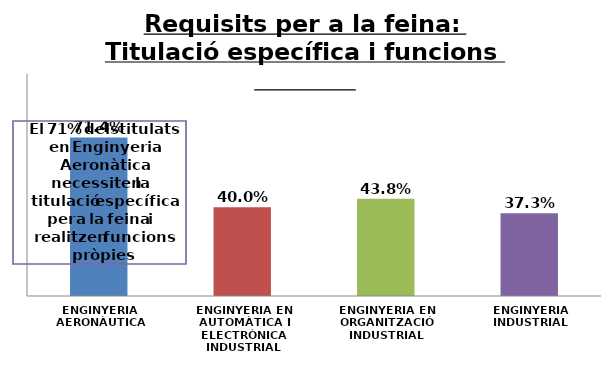
| Category | Series 2 |
|---|---|
| ENGINYERIA AERONÀUTICA | 0.714 |
| ENGINYERIA EN AUTOMÀTICA I ELECTRÒNICA INDUSTRIAL | 0.4 |
| ENGINYERIA EN ORGANITZACIÓ INDUSTRIAL | 0.438 |
| ENGINYERIA INDUSTRIAL | 0.373 |